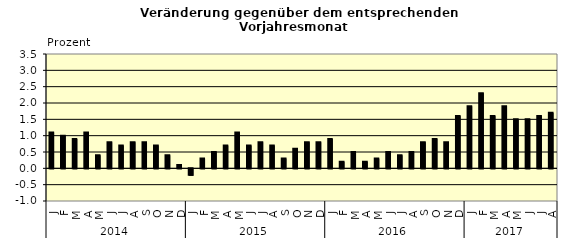
| Category | Series 0 |
|---|---|
| 0 | 1.1 |
| 1 | 1 |
| 2 | 0.9 |
| 3 | 1.1 |
| 4 | 0.4 |
| 5 | 0.8 |
| 6 | 0.7 |
| 7 | 0.8 |
| 8 | 0.8 |
| 9 | 0.7 |
| 10 | 0.4 |
| 11 | 0.1 |
| 12 | -0.2 |
| 13 | 0.3 |
| 14 | 0.5 |
| 15 | 0.7 |
| 16 | 1.1 |
| 17 | 0.7 |
| 18 | 0.8 |
| 19 | 0.7 |
| 20 | 0.3 |
| 21 | 0.6 |
| 22 | 0.8 |
| 23 | 0.8 |
| 24 | 0.9 |
| 25 | 0.2 |
| 26 | 0.5 |
| 27 | 0.2 |
| 28 | 0.3 |
| 29 | 0.5 |
| 30 | 0.4 |
| 31 | 0.5 |
| 32 | 0.8 |
| 33 | 0.9 |
| 34 | 0.8 |
| 35 | 1.6 |
| 36 | 1.9 |
| 37 | 2.3 |
| 38 | 1.6 |
| 39 | 1.9 |
| 40 | 1.5 |
| 41 | 1.5 |
| 42 | 1.6 |
| 43 | 1.7 |